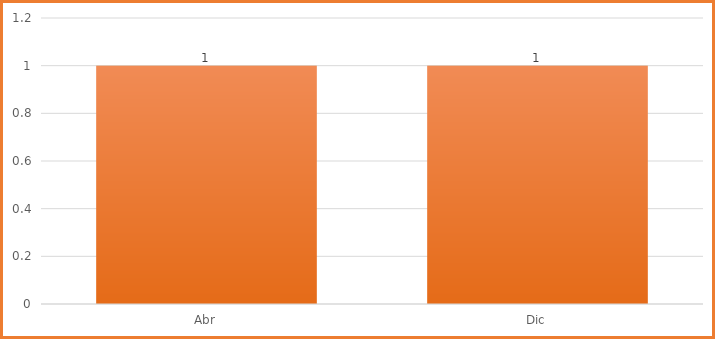
| Category | Total |
|---|---|
| Abr | 1 |
| Dic | 1 |